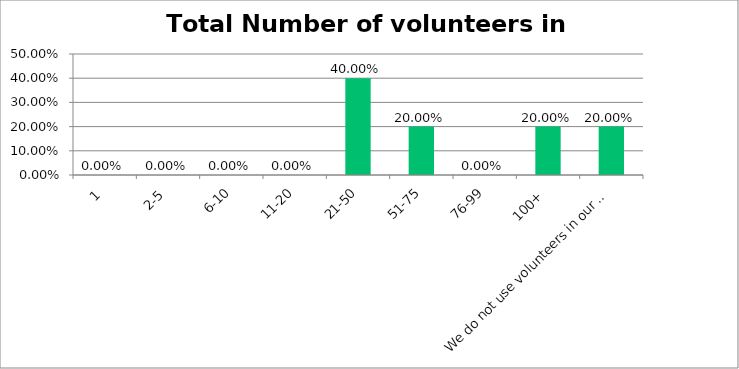
| Category | Responses |
|---|---|
| 1 | 0 |
| 2-5 | 0 |
| 6-10 | 0 |
| 11-20 | 0 |
| 21-50 | 0.4 |
| 51-75 | 0.2 |
| 76-99 | 0 |
| 100+ | 0.2 |
| We do not use volunteers in our organization | 0.2 |